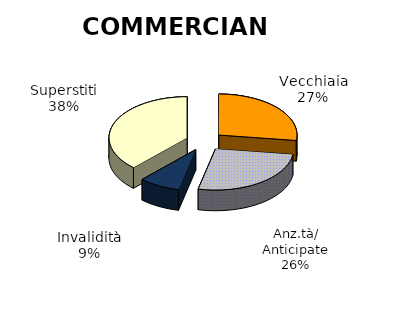
| Category | Series 0 |
|---|---|
| Vecchiaia | 3191 |
| Anz.tà/ Anticipate | 3114 |
| Invalidità | 1002 |
| Superstiti | 4467 |